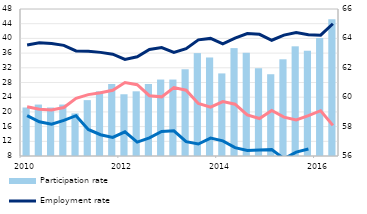
| Category | Participation rate  |
|---|---|
| 2010 | 59.3 |
| II | 59.5 |
| III | 59.3 |
| IV | 59.5 |
| 2011 | 58.9 |
| II | 59.8 |
| III | 60.4 |
| IV | 60.9 |
| 2012 | 60.2 |
| II | 60.4 |
| III | 60.9 |
| IV | 61.2 |
| 2013 | 61.2 |
| II | 61.9 |
| III | 63 |
| IV | 62.7 |
| 2014 | 61.618 |
| II | 63.339 |
| III | 63.021 |
| IV | 61.968 |
| 2015 | 61.562 |
| II | 62.578 |
| III | 63.461 |
| IV | 63.162 |
| 2016 | 64.03 |
| II | 65.299 |